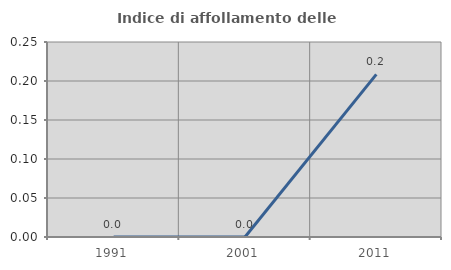
| Category | Indice di affollamento delle abitazioni  |
|---|---|
| 1991.0 | 0 |
| 2001.0 | 0 |
| 2011.0 | 0.209 |